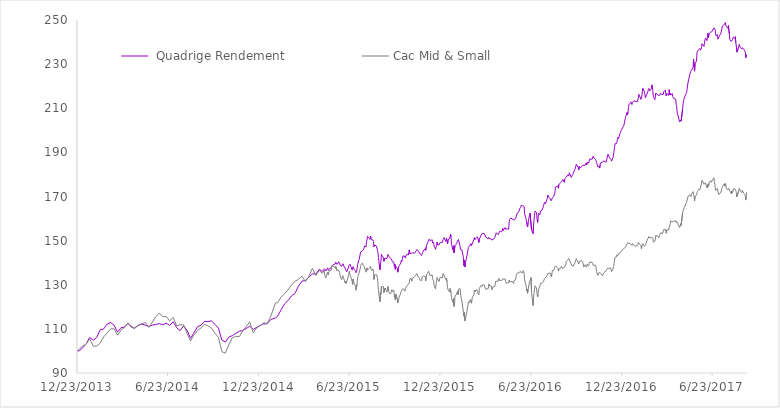
| Category |  Quadrige Rendement | Cac Mid & Small |
|---|---|---|
| 12/23/13 | 100 | 100 |
| 12/27/13 | 100.07 | 100.914 |
| 1/3/14 | 101.43 | 102.194 |
| 1/10/14 | 103.23 | 103.11 |
| 1/17/14 | 106.11 | 105.465 |
| 1/24/14 | 104.87 | 102.219 |
| 1/31/14 | 106.03 | 102.15 |
| 2/7/14 | 109.58 | 103.499 |
| 2/14/14 | 109.95 | 106.349 |
| 2/21/14 | 112.14 | 108.151 |
| 2/28/14 | 112.89 | 109.964 |
| 3/7/14 | 111.71 | 110.092 |
| 3/14/14 | 108.54 | 107.104 |
| 3/21/14 | 110.53 | 109.461 |
| 3/28/14 | 110.78 | 110.636 |
| 4/4/14 | 112.52 | 112.733 |
| 4/11/14 | 111.1 | 110.539 |
| 4/17/14 | 110.2 | 110.421 |
| 4/25/14 | 111.65 | 111.59 |
| 5/2/14 | 112.16 | 112.335 |
| 5/9/14 | 111.67 | 112.93 |
| 5/16/14 | 111.06 | 110.667 |
| 5/23/14 | 111.68 | 112.959 |
| 5/30/14 | 111.96 | 115.539 |
| 6/6/14 | 112.39 | 117.17 |
| 6/13/14 | 111.83 | 115.585 |
| 6/20/14 | 112.58 | 115.59 |
| 6/27/14 | 111.57 | 113.653 |
| 7/4/14 | 113.24 | 115.201 |
| 7/11/14 | 110.55 | 111.358 |
| 7/18/14 | 109.22 | 111.903 |
| 7/25/14 | 111.31 | 111.796 |
| 8/1/14 | 109.31 | 107.964 |
| 8/8/14 | 105.75 | 104.498 |
| 8/14/14 | 107.94 | 107.096 |
| 8/22/14 | 111.04 | 109.235 |
| 8/29/14 | 111.66 | 110.418 |
| 9/5/14 | 113.4 | 112.166 |
| 9/12/14 | 113.26 | 111.316 |
| 9/19/14 | 113.7 | 110.45 |
| 9/26/14 | 112.09 | 108.042 |
| 10/3/14 | 110.34 | 106.162 |
| 10/10/14 | 104.92 | 99.668 |
| 10/17/14 | 104 | 99.017 |
| 10/24/14 | 106.25 | 102.896 |
| 10/31/14 | 106.94 | 105.984 |
| 11/7/14 | 107.98 | 106.634 |
| 11/14/14 | 108.88 | 106.464 |
| 11/21/14 | 109.35 | 109.158 |
| 11/28/14 | 110.19 | 111.027 |
| 12/5/14 | 111.16 | 113.148 |
| 12/12/14 | 109.74 | 108.3 |
| 12/19/14 | 110.67 | 110.446 |
| 12/31/14 | 112.17 | 112.263 |
| 1/2/15 | 112.38 | 112.779 |
| 1/9/15 | 112.31 | 112.372 |
| 1/16/15 | 114.17 | 115.574 |
| 1/26/15 | 115.01 | 121.835 |
| 1/30/15 | 115.71 | 121.8 |
| 2/6/15 | 118.57 | 124.329 |
| 2/13/15 | 121.31 | 125.94 |
| 2/20/15 | 122.8 | 127.622 |
| 2/27/15 | 124.98 | 129.883 |
| 3/6/15 | 126.07 | 131.481 |
| 3/13/15 | 129.37 | 132.501 |
| 3/20/15 | 131.64 | 133.872 |
| 3/27/15 | 131.94 | 131.464 |
| 4/2/15 | 133.13 | 133.322 |
| 4/10/15 | 134.93 | 137.41 |
| 4/17/15 | 134.82 | 134.209 |
| 4/24/15 | 136.99 | 136.452 |
| 4/30/15 | 136.01 | 135.172 |
| 5/4/15 | 137.24 | 136.567 |
| 5/5/15 | 137.02 | 134.326 |
| 5/6/15 | 136.78 | 133.66 |
| 5/7/15 | 136.25 | 133.05 |
| 5/11/15 | 137.65 | 135.738 |
| 5/12/15 | 136.5 | 134.513 |
| 5/13/15 | 136.67 | 135.569 |
| 5/15/15 | 137.45 | 136.583 |
| 5/18/15 | 137.59 | 136.547 |
| 5/19/15 | 138.15 | 138.44 |
| 5/20/15 | 138.77 | 138.344 |
| 5/21/15 | 138.89 | 138.765 |
| 5/22/15 | 139.12 | 138.553 |
| 5/26/15 | 139.42 | 137.562 |
| 5/27/15 | 140.28 | 138.428 |
| 5/28/15 | 140.05 | 138.219 |
| 5/29/15 | 139.32 | 136.522 |
| 6/1/15 | 139.71 | 136.772 |
| 6/2/15 | 140.39 | 136.606 |
| 6/3/15 | 140.31 | 136.539 |
| 6/4/15 | 139.67 | 135.482 |
| 6/5/15 | 138.75 | 133.597 |
| 6/8/15 | 138.43 | 132.312 |
| 6/9/15 | 138.05 | 132.407 |
| 6/10/15 | 138.75 | 134.181 |
| 6/11/15 | 139.51 | 134.436 |
| 6/12/15 | 138.59 | 132.999 |
| 6/15/15 | 137.47 | 130.727 |
| 6/16/15 | 137.17 | 131.578 |
| 6/17/15 | 136.45 | 130.655 |
| 6/18/15 | 135.86 | 130.317 |
| 6/19/15 | 136.25 | 130.834 |
| 6/22/15 | 138.04 | 134.353 |
| 6/23/15 | 138.82 | 136.012 |
| 6/24/15 | 139.14 | 135.167 |
| 6/25/15 | 139.32 | 135.472 |
| 6/26/15 | 139.51 | 135.545 |
| 6/29/15 | 136.65 | 131.622 |
| 6/30/15 | 136.55 | 130.132 |
| 7/1/15 | 138.25 | 132.529 |
| 7/2/15 | 137.69 | 131.383 |
| 7/3/15 | 137.04 | 130.713 |
| 7/6/15 | 136.19 | 129.328 |
| 7/7/15 | 135.46 | 127.543 |
| 7/8/15 | 135.97 | 127.826 |
| 7/9/15 | 137.41 | 130.392 |
| 7/10/15 | 139.11 | 133.177 |
| 7/13/15 | 141.42 | 135.319 |
| 7/15/15 | 143.47 | 137.017 |
| 7/16/15 | 144.83 | 138.692 |
| 7/17/15 | 144.84 | 139.213 |
| 7/20/15 | 145.39 | 139.785 |
| 7/21/15 | 145.49 | 138.883 |
| 7/22/15 | 145.99 | 138.585 |
| 7/23/15 | 146.68 | 138.404 |
| 7/24/15 | 147.6 | 138.221 |
| 7/27/15 | 147.19 | 135.699 |
| 7/28/15 | 149.49 | 136.644 |
| 7/29/15 | 150.29 | 137.635 |
| 7/30/15 | 151.94 | 136.656 |
| 7/31/15 | 151.71 | 136.913 |
| 8/3/15 | 151 | 137.556 |
| 8/4/15 | 150.54 | 137.666 |
| 8/5/15 | 152.07 | 138.375 |
| 8/6/15 | 151.05 | 138.12 |
| 8/7/15 | 150.39 | 136.507 |
| 8/10/15 | 150.29 | 137.147 |
| 8/11/15 | 149.56 | 135.655 |
| 8/12/15 | 147.26 | 132.382 |
| 8/13/15 | 148.02 | 134.424 |
| 8/14/15 | 147.97 | 134.528 |
| 8/17/15 | 147.55 | 134.583 |
| 8/18/15 | 147.15 | 134.713 |
| 8/19/15 | 145.59 | 133.062 |
| 8/20/15 | 144.55 | 130.398 |
| 8/21/15 | 142.33 | 127.384 |
| 8/24/15 | 136.8 | 122.241 |
| 8/25/15 | 139.46 | 126.369 |
| 8/26/15 | 140.68 | 125.746 |
| 8/27/15 | 143.7 | 129.169 |
| 8/28/15 | 143.16 | 129.532 |
| 8/31/15 | 142.39 | 129.144 |
| 9/1/15 | 140.59 | 126.424 |
| 9/2/15 | 140.37 | 126.369 |
| 9/3/15 | 142.02 | 128.491 |
| 9/7/15 | 141.87 | 126.664 |
| 9/8/15 | 142.69 | 127.633 |
| 9/9/15 | 143.76 | 129.222 |
| 9/10/15 | 143.5 | 128.276 |
| 9/11/15 | 142.73 | 126.65 |
| 9/14/15 | 142.19 | 125.752 |
| 9/15/15 | 142.48 | 126.277 |
| 9/16/15 | 142.22 | 127.125 |
| 9/17/15 | 141.15 | 127.798 |
| 9/18/15 | 140.41 | 126.887 |
| 9/21/15 | 140.25 | 127.581 |
| 9/22/15 | 138.28 | 124.612 |
| 9/23/15 | 139.36 | 125.37 |
| 9/24/15 | 136.99 | 123.229 |
| 9/25/15 | 138.21 | 125.64 |
| 9/28/15 | 137.37 | 123.455 |
| 9/29/15 | 135.7 | 121.814 |
| 9/30/15 | 137.6 | 123.265 |
| 10/1/15 | 137.84 | 123.102 |
| 10/2/15 | 138.75 | 123.567 |
| 10/5/15 | 139.84 | 126.355 |
| 10/6/15 | 141.08 | 127.175 |
| 10/7/15 | 140.52 | 126.777 |
| 10/8/15 | 141.36 | 127.524 |
| 10/9/15 | 142.98 | 128.169 |
| 10/12/15 | 143.08 | 127.824 |
| 10/13/15 | 142.74 | 127.081 |
| 10/14/15 | 142.1 | 126.662 |
| 10/15/15 | 142.48 | 128.452 |
| 10/16/15 | 143.5 | 129.175 |
| 10/19/15 | 143.95 | 129.91 |
| 10/20/15 | 143.41 | 129.61 |
| 10/21/15 | 144.59 | 129.752 |
| 10/22/15 | 145.82 | 130.788 |
| 10/23/15 | 144.12 | 132.706 |
| 10/26/15 | 144.29 | 132.768 |
| 10/27/15 | 144.63 | 131.651 |
| 10/28/15 | 144.36 | 132.85 |
| 10/29/15 | 144.45 | 132.565 |
| 10/30/15 | 144.18 | 132.809 |
| 11/2/15 | 144.36 | 133.65 |
| 11/3/15 | 144.61 | 133.931 |
| 11/4/15 | 145.09 | 134.274 |
| 11/5/15 | 144.93 | 134.125 |
| 11/6/15 | 145.87 | 135.08 |
| 11/9/15 | 145.52 | 133.513 |
| 11/10/15 | 145 | 133.152 |
| 11/12/15 | 144.87 | 132.7 |
| 11/13/15 | 143.9 | 131.982 |
| 11/16/15 | 143.26 | 131.961 |
| 11/17/15 | 144.01 | 133.718 |
| 11/18/15 | 144.62 | 133.607 |
| 11/19/15 | 144.95 | 134.122 |
| 11/20/15 | 145.66 | 134.013 |
| 11/23/15 | 146.23 | 133.734 |
| 11/24/15 | 145.58 | 131.749 |
| 11/25/15 | 147.03 | 133.285 |
| 11/26/15 | 147.98 | 134.734 |
| 11/27/15 | 148.35 | 135.082 |
| 11/30/15 | 150.2 | 136.122 |
| 12/1/15 | 150.66 | 136.19 |
| 12/2/15 | 150.75 | 136.352 |
| 12/3/15 | 149.9 | 134.141 |
| 12/4/15 | 149.74 | 133.807 |
| 12/7/15 | 150.42 | 134.476 |
| 12/8/15 | 148.89 | 132.793 |
| 12/9/15 | 149.37 | 132.266 |
| 12/10/15 | 148.87 | 131.62 |
| 12/11/15 | 147.47 | 129.442 |
| 12/14/15 | 146.06 | 128.088 |
| 12/15/15 | 147.16 | 130.5 |
| 12/16/15 | 148.21 | 131.631 |
| 12/17/15 | 149.26 | 133.213 |
| 12/18/15 | 148.08 | 132.619 |
| 12/21/15 | 148.07 | 131.473 |
| 12/22/15 | 147.75 | 131.352 |
| 12/23/15 | 149.17 | 133.418 |
| 12/24/15 | 149.25 | 133.433 |
| 12/28/15 | 149.24 | 133.154 |
| 12/29/15 | 150.44 | 135.103 |
| 12/30/15 | 150.91 | 135.423 |
| 12/31/15 | 151.39 | 134.819 |
| 1/4/16 | 149.55 | 132.344 |
| 1/5/16 | 151.05 | 132.951 |
| 1/6/16 | 150.51 | 131.217 |
| 1/7/16 | 148.47 | 128.612 |
| 1/8/16 | 150.07 | 127.888 |
| 1/11/16 | 151.19 | 126.726 |
| 1/12/16 | 151.87 | 128.32 |
| 1/13/16 | 152.96 | 128.55 |
| 1/14/16 | 151.53 | 126.314 |
| 1/15/16 | 148.41 | 123.888 |
| 1/18/16 | 145.79 | 121.999 |
| 1/19/16 | 147.65 | 123.884 |
| 1/20/16 | 144.44 | 120.203 |
| 1/21/16 | 144.62 | 121.193 |
| 1/22/16 | 147.77 | 124.932 |
| 1/25/16 | 148.58 | 125.542 |
| 1/26/16 | 149.26 | 126.499 |
| 1/27/16 | 148.85 | 126.965 |
| 1/28/16 | 149.29 | 125.496 |
| 1/29/16 | 150.55 | 127.875 |
| 2/1/16 | 147.77 | 128.396 |
| 2/2/16 | 146 | 126.665 |
| 2/3/16 | 145.61 | 124.523 |
| 2/4/16 | 145.75 | 123.588 |
| 2/5/16 | 145.77 | 122.384 |
| 2/8/16 | 142.24 | 117.363 |
| 2/9/16 | 138.64 | 115.75 |
| 2/10/16 | 141.22 | 117.528 |
| 2/11/16 | 138.08 | 113.594 |
| 2/12/16 | 139.76 | 114.395 |
| 2/15/16 | 143.25 | 117.888 |
| 2/16/16 | 143.36 | 118.015 |
| 2/17/16 | 145.73 | 120.706 |
| 2/18/16 | 146.98 | 122.279 |
| 2/19/16 | 146.56 | 121.722 |
| 2/22/16 | 148.02 | 123.336 |
| 2/23/16 | 148.7 | 123.081 |
| 2/24/16 | 147.7 | 121.642 |
| 2/25/16 | 147.55 | 122.968 |
| 2/26/16 | 147.7 | 124.398 |
| 2/29/16 | 150.41 | 125.46 |
| 3/1/16 | 151.32 | 127.564 |
| 3/2/16 | 150.46 | 126.794 |
| 3/3/16 | 150.75 | 126.66 |
| 3/4/16 | 150.79 | 127.725 |
| 3/7/16 | 151.72 | 127.437 |
| 3/8/16 | 151.18 | 126.243 |
| 3/9/16 | 151.04 | 126.63 |
| 3/10/16 | 149.16 | 125.362 |
| 3/11/16 | 150.66 | 128.286 |
| 3/14/16 | 152.16 | 129.619 |
| 3/15/16 | 151.96 | 129.482 |
| 3/16/16 | 152.38 | 129.49 |
| 3/17/16 | 153.3 | 129.44 |
| 3/18/16 | 153.75 | 130.047 |
| 3/21/16 | 153.16 | 129.781 |
| 3/22/16 | 153.17 | 129.73 |
| 3/23/16 | 152.84 | 129.808 |
| 3/24/16 | 151.55 | 127.895 |
| 3/29/16 | 150.88 | 128.308 |
| 3/30/16 | 151.49 | 130.382 |
| 3/31/16 | 150.97 | 130.01 |
| 4/1/16 | 150.64 | 129.475 |
| 4/4/16 | 150.73 | 129.501 |
| 4/5/16 | 150.27 | 127.722 |
| 4/6/16 | 150.61 | 128.091 |
| 4/7/16 | 150.23 | 127.608 |
| 4/8/16 | 150.52 | 129.095 |
| 4/11/16 | 151.48 | 129.236 |
| 4/12/16 | 151.14 | 129.629 |
| 4/13/16 | 152.62 | 131.61 |
| 4/14/16 | 153.59 | 131.914 |
| 4/15/16 | 153.44 | 131.179 |
| 4/18/16 | 152.65 | 131.598 |
| 4/19/16 | 152.78 | 132.868 |
| 4/20/16 | 153.82 | 132.759 |
| 4/21/16 | 153.8 | 131.962 |
| 4/22/16 | 154.4 | 132.028 |
| 4/25/16 | 154.01 | 131.913 |
| 4/26/16 | 154.47 | 131.929 |
| 4/27/16 | 155.52 | 132.641 |
| 4/28/16 | 154.6 | 132.958 |
| 4/29/16 | 154.79 | 132.269 |
| 5/2/16 | 155.91 | 132.545 |
| 5/3/16 | 155.25 | 131.368 |
| 5/4/16 | 155.23 | 130.649 |
| 5/6/16 | 155.29 | 130.628 |
| 5/9/16 | 155.16 | 131.048 |
| 5/10/16 | 158.51 | 132.04 |
| 5/11/16 | 159.49 | 131.307 |
| 5/12/16 | 159.17 | 130.939 |
| 5/13/16 | 160.22 | 131.114 |
| 5/17/16 | 159.81 | 131.466 |
| 5/18/16 | 159.49 | 131.67 |
| 5/19/16 | 159.31 | 130.585 |
| 5/20/16 | 159.47 | 131.948 |
| 5/23/16 | 159.96 | 132.27 |
| 5/24/16 | 160.84 | 133.881 |
| 5/25/16 | 161.79 | 134.69 |
| 5/26/16 | 161.98 | 135.212 |
| 5/27/16 | 162.55 | 135.349 |
| 5/30/16 | 163.42 | 135.586 |
| 5/31/16 | 164.37 | 135.775 |
| 6/1/16 | 164.73 | 135.55 |
| 6/2/16 | 165.04 | 136.068 |
| 6/3/16 | 165.95 | 135.433 |
| 6/6/16 | 165.86 | 135.483 |
| 6/7/16 | 165.81 | 136.464 |
| 6/8/16 | 165.66 | 135.92 |
| 6/9/16 | 165.49 | 135.243 |
| 6/10/16 | 162.37 | 132.3 |
| 6/13/16 | 159.96 | 129.65 |
| 6/14/16 | 157.94 | 127.228 |
| 6/15/16 | 158.33 | 128.07 |
| 6/16/16 | 156.2 | 126.161 |
| 6/17/16 | 158.21 | 127.693 |
| 6/20/16 | 161.54 | 131.308 |
| 6/21/16 | 162.42 | 131.529 |
| 6/22/16 | 162.08 | 131.686 |
| 6/23/16 | 162.7 | 133.295 |
| 6/24/16 | 154.84 | 126.578 |
| 6/27/16 | 153.18 | 120.567 |
| 6/28/16 | 156.48 | 123.661 |
| 6/29/16 | 159.45 | 126.407 |
| 6/30/16 | 161.27 | 127.668 |
| 7/1/16 | 163.41 | 129.527 |
| 7/4/16 | 162.69 | 128.512 |
| 7/5/16 | 160.02 | 126.06 |
| 7/6/16 | 158.25 | 124.454 |
| 7/7/16 | 159.61 | 125.399 |
| 7/8/16 | 162.28 | 127.669 |
| 7/11/16 | 161.76 | 129.677 |
| 7/12/16 | 163.47 | 130.642 |
| 7/13/16 | 163.63 | 130.616 |
| 7/15/16 | 163.71 | 130.634 |
| 7/18/16 | 165.57 | 131.397 |
| 7/19/16 | 165.58 | 131.226 |
| 7/20/16 | 167.43 | 132.792 |
| 7/21/16 | 167.47 | 132.631 |
| 7/22/16 | 166.72 | 132.826 |
| 7/25/16 | 168.67 | 133.929 |
| 7/26/16 | 169.36 | 134.033 |
| 7/27/16 | 170.53 | 135.173 |
| 7/28/16 | 169.8 | 134.955 |
| 7/29/16 | 169.61 | 135.417 |
| 8/1/16 | 169.05 | 135.217 |
| 8/2/16 | 168.06 | 134.377 |
| 8/3/16 | 167.61 | 133.594 |
| 8/4/16 | 168.79 | 135.034 |
| 8/5/16 | 169.4 | 136.461 |
| 8/8/16 | 170.13 | 136.464 |
| 8/9/16 | 171.17 | 137.667 |
| 8/10/16 | 171.63 | 137.621 |
| 8/11/16 | 174.26 | 138.588 |
| 8/12/16 | 174.05 | 138.567 |
| 8/16/16 | 174.78 | 137.45 |
| 8/17/16 | 173.78 | 136.21 |
| 8/18/16 | 175.46 | 137.114 |
| 8/19/16 | 175.09 | 136.797 |
| 8/22/16 | 176.34 | 137.584 |
| 8/23/16 | 176.25 | 138.322 |
| 8/24/16 | 176.86 | 138.516 |
| 8/25/16 | 176.55 | 137.477 |
| 8/26/16 | 177.68 | 137.774 |
| 8/29/16 | 176.45 | 137.78 |
| 8/30/16 | 178.13 | 138.265 |
| 8/31/16 | 178.02 | 138.301 |
| 9/1/16 | 178.5 | 139.092 |
| 9/2/16 | 178.78 | 140.582 |
| 9/5/16 | 179.81 | 141.249 |
| 9/6/16 | 179.45 | 141.242 |
| 9/7/16 | 179.25 | 141.886 |
| 9/8/16 | 180.77 | 141.582 |
| 9/9/16 | 180.78 | 140.724 |
| 9/12/16 | 178.67 | 139.527 |
| 9/13/16 | 179.27 | 138.709 |
| 9/14/16 | 179.24 | 138.427 |
| 9/15/16 | 180 | 138.663 |
| 9/16/16 | 180.17 | 138.514 |
| 9/19/16 | 182.12 | 139.774 |
| 9/20/16 | 182.48 | 139.699 |
| 9/21/16 | 183.53 | 139.721 |
| 9/22/16 | 184.59 | 141.798 |
| 9/23/16 | 184.32 | 141.353 |
| 9/26/16 | 183.08 | 139.961 |
| 9/27/16 | 182.01 | 139.378 |
| 9/28/16 | 183.63 | 140.485 |
| 9/29/16 | 183.46 | 140.451 |
| 9/30/16 | 183.08 | 140.217 |
| 10/3/16 | 183.49 | 140.916 |
| 10/4/16 | 183.88 | 141.07 |
| 10/5/16 | 184.15 | 140.197 |
| 10/6/16 | 184.47 | 139.484 |
| 10/7/16 | 183.91 | 138.035 |
| 10/10/16 | 184.21 | 139.057 |
| 10/11/16 | 183.97 | 138.425 |
| 10/12/16 | 185.12 | 138.289 |
| 10/13/16 | 184.41 | 137.91 |
| 10/14/16 | 185.49 | 139.343 |
| 10/17/16 | 185.19 | 138.617 |
| 10/18/16 | 185.38 | 139.711 |
| 10/19/16 | 187.02 | 140.29 |
| 10/20/16 | 187.27 | 140.254 |
| 10/21/16 | 186.88 | 140.21 |
| 10/24/16 | 186.92 | 140.165 |
| 10/25/16 | 187.22 | 139.521 |
| 10/26/16 | 188.24 | 138.858 |
| 10/27/16 | 187.58 | 138.47 |
| 10/28/16 | 187.42 | 138.868 |
| 10/31/16 | 186.79 | 138.808 |
| 11/2/16 | 185.4 | 135.908 |
| 11/3/16 | 184.44 | 135.59 |
| 11/4/16 | 183.54 | 134.2 |
| 11/7/16 | 183.5 | 135.558 |
| 11/8/16 | 182.88 | 135.665 |
| 11/9/16 | 184.36 | 135.959 |
| 11/10/16 | 185.25 | 135.223 |
| 11/14/16 | 185.6 | 134.07 |
| 11/15/16 | 185.41 | 134.814 |
| 11/16/16 | 186.12 | 135.041 |
| 11/17/16 | 185.76 | 135.527 |
| 11/18/16 | 186.48 | 135.961 |
| 11/21/16 | 185.6 | 136.257 |
| 11/22/16 | 186.47 | 136.922 |
| 11/23/16 | 187.2 | 136.495 |
| 11/24/16 | 188.59 | 137.086 |
| 11/25/16 | 189.15 | 137.592 |
| 11/28/16 | 187.63 | 137.171 |
| 11/29/16 | 187.18 | 137.392 |
| 11/30/16 | 187.76 | 137.831 |
| 12/1/16 | 186.69 | 137.012 |
| 12/2/16 | 186.03 | 135.911 |
| 12/5/16 | 187.77 | 137.19 |
| 12/6/16 | 189.25 | 138.137 |
| 12/7/16 | 190.38 | 139.741 |
| 12/8/16 | 192.17 | 140.833 |
| 12/9/16 | 193.93 | 142.503 |
| 12/12/16 | 193.99 | 142.611 |
| 12/13/16 | 194.94 | 143.577 |
| 12/14/16 | 196.39 | 143.016 |
| 12/15/16 | 196.88 | 143.588 |
| 12/16/16 | 196.23 | 144.203 |
| 12/19/16 | 198.5 | 144.416 |
| 12/20/16 | 199.09 | 144.909 |
| 12/21/16 | 199.76 | 145.268 |
| 12/22/16 | 200.25 | 145.189 |
| 12/23/16 | 200.61 | 145.68 |
| 12/27/16 | 202.37 | 146.431 |
| 12/28/16 | 203.71 | 146.443 |
| 12/29/16 | 204.15 | 146.772 |
| 12/30/16 | 205.79 | 147.055 |
| 1/2/17 | 208 | 148.416 |
| 1/3/17 | 206.96 | 148.969 |
| 1/4/17 | 208.19 | 148.538 |
| 1/5/17 | 210.33 | 148.718 |
| 1/6/17 | 211.78 | 148.807 |
| 1/9/17 | 212.33 | 148.546 |
| 1/10/17 | 212.89 | 148.785 |
| 1/11/17 | 213.15 | 148.851 |
| 1/12/17 | 211.67 | 147.849 |
| 1/13/17 | 212.5 | 148.619 |
| 1/16/17 | 213.45 | 147.96 |
| 1/17/17 | 213.25 | 147.638 |
| 1/18/17 | 213.09 | 147.457 |
| 1/19/17 | 213.07 | 147.86 |
| 1/20/17 | 212.63 | 147.435 |
| 1/23/17 | 212.99 | 147.759 |
| 1/24/17 | 213.42 | 148.23 |
| 1/25/17 | 214.72 | 149.204 |
| 1/26/17 | 216.34 | 149.359 |
| 1/27/17 | 215.83 | 149.182 |
| 1/30/17 | 214 | 147.735 |
| 1/31/17 | 214.123 | 146.353 |
| 2/1/17 | 215.55 | 147.471 |
| 2/2/17 | 217.68 | 148.253 |
| 2/3/17 | 219.09 | 148.71 |
| 2/6/17 | 217.4 | 147.314 |
| 2/7/17 | 216.69 | 147.73 |
| 2/8/17 | 214.75 | 147.867 |
| 2/9/17 | 215.39 | 148.384 |
| 2/10/17 | 215.92 | 149.405 |
| 2/13/17 | 217.41 | 150.787 |
| 2/14/17 | 218.48 | 151.247 |
| 2/15/17 | 218.98 | 151.89 |
| 2/16/17 | 219.1 | 151.741 |
| 2/17/17 | 217.9 | 151.163 |
| 2/20/17 | 218.78 | 151.404 |
| 2/21/17 | 220.59 | 151.809 |
| 2/22/17 | 219.21 | 151.581 |
| 2/23/17 | 218.17 | 151.236 |
| 2/24/17 | 215.27 | 149.316 |
| 2/27/17 | 213.93 | 149.764 |
| 2/28/17 | 214.85 | 150.386 |
| 3/1/17 | 216.92 | 152.357 |
| 3/2/17 | 217.3 | 152.409 |
| 3/3/17 | 216.62 | 152.165 |
| 3/6/17 | 215.67 | 151.884 |
| 3/7/17 | 215.5 | 151.297 |
| 3/8/17 | 215.94 | 151.859 |
| 3/9/17 | 215.88 | 152.69 |
| 3/10/17 | 216.85 | 153.383 |
| 3/13/17 | 216.24 | 153.533 |
| 3/14/17 | 216.09 | 152.972 |
| 3/15/17 | 216.31 | 153.07 |
| 3/16/17 | 216.22 | 154.204 |
| 3/17/17 | 217.46 | 154.987 |
| 3/20/17 | 218.23 | 155.076 |
| 3/21/17 | 216.55 | 154.045 |
| 3/22/17 | 215.66 | 153.356 |
| 3/23/17 | 216.67 | 154.843 |
| 3/24/17 | 216.72 | 155.166 |
| 3/27/17 | 215.81 | 154.772 |
| 3/28/17 | 218.45 | 155.958 |
| 3/29/17 | 216.11 | 156.356 |
| 3/30/17 | 216.84 | 157.567 |
| 3/31/17 | 215.94 | 158.938 |
| 4/3/17 | 216.67 | 158.503 |
| 4/4/17 | 215.32 | 158.59 |
| 4/5/17 | 214.89 | 158.79 |
| 4/6/17 | 214.37 | 158.82 |
| 4/7/17 | 213.93 | 159.17 |
| 4/10/17 | 214.14 | 158.98 |
| 4/11/17 | 211.67 | 158.26 |
| 4/12/17 | 210.71 | 158.8 |
| 4/13/17 | 208.21 | 158.26 |
| 4/18/17 | 203.81 | 155.9 |
| 4/19/17 | 203.55 | 156.67 |
| 4/20/17 | 204.7 | 157.69 |
| 4/21/17 | 204.16 | 156.91 |
| 4/24/17 | 209.8 | 162.7 |
| 4/25/17 | 212.22 | 163.64 |
| 4/26/17 | 213.58 | 164.06 |
| 4/27/17 | 213.56 | 164.93 |
| 4/28/17 | 215.12 | 165.37 |
| 5/2/17 | 217.2 | 167.38 |
| 5/3/17 | 217.21 | 166.93 |
| 5/5/17 | 221.88 | 170.11 |
| 5/9/17 | 225.86 | 170.73 |
| 5/10/17 | 226.64 | 171.02 |
| 5/11/17 | 226.54 | 170.03 |
| 5/12/17 | 226.35 | 171.16 |
| 5/15/17 | 228.51 | 172.22 |
| 5/16/17 | 232.15 | 172.36 |
| 5/17/17 | 228.95 | 170.13 |
| 5/18/17 | 228.95 | 168.03 |
| 5/18/17 | 228.95 | 168.03 |
| 5/18/17 | 226.79 | 168.03 |
| 5/19/17 | 230.35 | 170.09 |
| 5/22/17 | 231.41 | 170.61 |
| 5/23/17 | 235.37 | 171.73 |
| 5/24/17 | 235.22 | 172.29 |
| 5/26/17 | 236.52 | 173.18 |
| 5/29/17 | 237.07 | 173.15 |
| 5/30/17 | 236.33 | 173.39 |
| 5/31/17 | 236.48 | 173.58 |
| 6/1/17 | 237.53 | 176.14 |
| 6/2/17 | 239.27 | 177.39 |
| 6/6/17 | 238.03 | 175.53 |
| 6/7/17 | 239.99 | 175.98 |
| 6/8/17 | 239.84 | 175.49 |
| 6/9/17 | 241.8 | 176.25 |
| 6/12/17 | 240.64 | 173.9 |
| 6/13/17 | 242.67 | 175.05 |
| 6/14/17 | 243.97 | 175.63 |
| 6/15/17 | 242.07 | 174.62 |
| 6/16/17 | 243.79 | 176.02 |
| 6/19/17 | 244.42 | 177.11 |
| 6/20/17 | 244.26 | 176.67 |
| 6/21/17 | 244.36 | 176.43 |
| 6/22/17 | 244.7 | 177.17 |
| 6/23/17 | 244.45 | 177.04 |
| 6/26/17 | 246.45 | 178.47 |
| 6/27/17 | 246.12 | 176.18 |
| 6/28/17 | 245.84 | 175.53 |
| 6/29/17 | 244.48 | 172.83 |
| 6/30/17 | 242.88 | 172.77 |
| 7/3/17 | 243.38 | 173.57 |
| 7/4/17 | 241.31 | 172.01 |
| 7/5/17 | 241.38 | 172.33 |
| 7/6/17 | 242.26 | 170.91 |
| 7/7/17 | 242.82 | 171.3 |
| 7/10/17 | 244.07 | 172 |
| 7/11/17 | 244.04 | 171.7 |
| 7/12/17 | 246.12 | 173.59 |
| 7/13/17 | 247.28 | 174.32 |
| 7/17/17 | 247.95 | 175.73 |
| 7/18/17 | 247.75 | 174.71 |
| 7/19/17 | 248.83 | 175.89 |
| 7/20/17 | 247.39 | 175.3 |
| 7/21/17 | 246.85 | 173.44 |
| 7/24/17 | 246.27 | 172.97 |
| 7/25/17 | 247.53 | 173.2 |
| 7/26/17 | 247.2 | 173.73 |
| 7/27/17 | 243.71 | 172.96 |
| 7/28/17 | 241.02 | 172.96 |
| 7/31/17 | 240.31 | 171.21 |
| 8/1/17 | 240.29 | 172.53 |
| 8/2/17 | 241.05 | 171.68 |
| 8/3/17 | 241.44 | 172.26 |
| 8/4/17 | 242.26 | 173.35 |
| 8/7/17 | 241.6 | 173.57 |
| 8/8/17 | 242.43 | 174.01 |
| 8/9/17 | 239.7 | 172.67 |
| 8/10/17 | 238.25 | 171.83 |
| 8/11/17 | 235.43 | 169.79 |
| 8/14/17 | 237.2 | 171.9 |
| 8/16/17 | 238.92 | 173.72 |
| 8/17/17 | 239.01 | 173.67 |
| 8/18/17 | 237.61 | 172.31 |
| 8/21/17 | 236.79 | 171.78 |
| 8/22/17 | 237.49 | 172.85 |
| 8/23/17 | 237.75 | 172.33 |
| 8/24/17 | 237.24 | 171.94 |
| 8/25/17 | 236.66 | 171.44 |
| 8/28/17 | 235.61 | 170.47 |
| 8/29/17 | 232.92 | 168.38 |
| 8/30/17 | 233.51 | 170.09 |
| 8/31/17 | 234.32 | 172.08 |